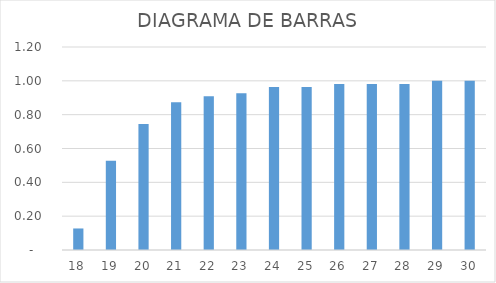
| Category | Series 0 |
|---|---|
| 18.0 | 0.127 |
| 19.0 | 0.527 |
| 20.0 | 0.745 |
| 21.0 | 0.873 |
| 22.0 | 0.909 |
| 23.0 | 0.927 |
| 24.0 | 0.964 |
| 25.0 | 0.964 |
| 26.0 | 0.982 |
| 27.0 | 0.982 |
| 28.0 | 0.982 |
| 29.0 | 1 |
| 30.0 | 1 |